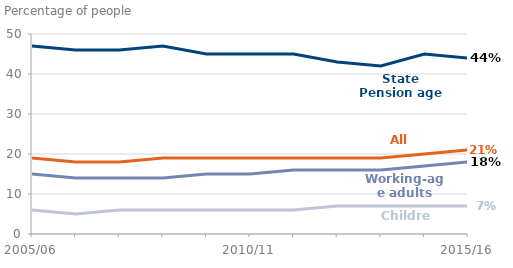
| Category | Working-age adults | State Pension age adults1 | Children | All people |
|---|---|---|---|---|
| 2005/06 | 15 | 47 | 6 | 19 |
| 2006/07 | 14 | 46 | 5 | 18 |
| 2007/08 | 14 | 46 | 6 | 18 |
| 2008/09 | 14 | 47 | 6 | 19 |
| 2009/10 | 15 | 45 | 6 | 19 |
| 2010/11 | 15 | 45 | 6 | 19 |
| 2011/12 | 16 | 45 | 6 | 19 |
| 2012/13 | 16 | 43 | 7 | 19 |
| 2013/14 | 16 | 42 | 7 | 19 |
| 2014/15 | 17 | 45 | 7 | 20 |
| 2015/16 | 18 | 44 | 7 | 21 |